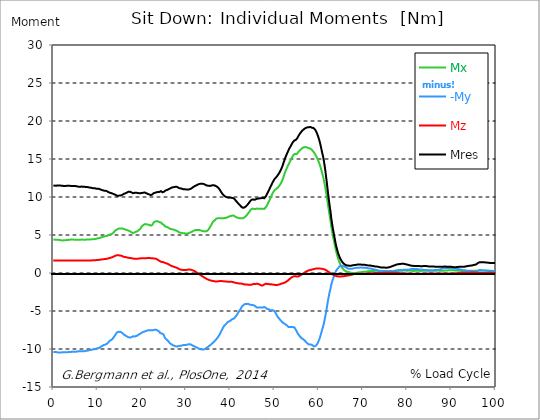
| Category |  Mx |  -My |  Mz |  Mres |
|---|---|---|---|---|
| 0.0 | 4.4 | -10.39 | 1.64 | 11.49 |
| 0.167348456675344 | 4.4 | -10.41 | 1.64 | 11.5 |
| 0.334696913350688 | 4.39 | -10.41 | 1.64 | 11.5 |
| 0.5020453700260321 | 4.38 | -10.42 | 1.64 | 11.5 |
| 0.669393826701376 | 4.38 | -10.41 | 1.64 | 11.49 |
| 0.83674228337672 | 4.38 | -10.42 | 1.64 | 11.5 |
| 1.0040907400520642 | 4.37 | -10.45 | 1.64 | 11.52 |
| 1.1621420602454444 | 4.35 | -10.45 | 1.64 | 11.52 |
| 1.3294905169207885 | 4.35 | -10.45 | 1.64 | 11.51 |
| 1.4968389735961325 | 4.34 | -10.45 | 1.64 | 11.51 |
| 1.6641874302714765 | 4.32 | -10.45 | 1.64 | 11.5 |
| 1.8315358869468206 | 4.29 | -10.45 | 1.64 | 11.49 |
| 1.9988843436221646 | 4.28 | -10.44 | 1.65 | 11.47 |
| 2.1662328002975086 | 4.28 | -10.43 | 1.65 | 11.46 |
| 2.333581256972853 | 4.3 | -10.43 | 1.65 | 11.46 |
| 2.5009297136481967 | 4.31 | -10.42 | 1.64 | 11.46 |
| 2.6682781703235405 | 4.31 | -10.41 | 1.64 | 11.45 |
| 2.8356266269988843 | 4.32 | -10.41 | 1.63 | 11.46 |
| 3.002975083674229 | 4.33 | -10.43 | 1.63 | 11.47 |
| 3.1703235403495724 | 4.35 | -10.42 | 1.63 | 11.47 |
| 3.337671997024917 | 4.35 | -10.41 | 1.64 | 11.47 |
| 3.4957233172182973 | 4.37 | -10.41 | 1.64 | 11.47 |
| 3.663071773893641 | 4.38 | -10.41 | 1.64 | 11.47 |
| 3.8304202305689854 | 4.39 | -10.4 | 1.64 | 11.46 |
| 3.997768687244329 | 4.4 | -10.38 | 1.65 | 11.46 |
| 4.165117143919673 | 4.41 | -10.37 | 1.65 | 11.45 |
| 4.332465600595017 | 4.4 | -10.36 | 1.65 | 11.44 |
| 4.499814057270361 | 4.4 | -10.36 | 1.65 | 11.43 |
| 4.667162513945706 | 4.39 | -10.37 | 1.65 | 11.44 |
| 4.834510970621049 | 4.39 | -10.37 | 1.65 | 11.44 |
| 5.001859427296393 | 4.38 | -10.37 | 1.65 | 11.44 |
| 5.169207883971737 | 4.37 | -10.37 | 1.65 | 11.43 |
| 5.336556340647081 | 4.37 | -10.34 | 1.65 | 11.4 |
| 5.503904797322425 | 4.36 | -10.31 | 1.66 | 11.38 |
| 5.671253253997769 | 4.36 | -10.3 | 1.66 | 11.36 |
| 5.82930457419115 | 4.36 | -10.29 | 1.65 | 11.35 |
| 5.996653030866494 | 4.36 | -10.28 | 1.65 | 11.34 |
| 6.164001487541838 | 4.39 | -10.28 | 1.65 | 11.35 |
| 6.331349944217181 | 4.4 | -10.29 | 1.65 | 11.37 |
| 6.498698400892526 | 4.4 | -10.3 | 1.66 | 11.38 |
| 6.66604685756787 | 4.39 | -10.29 | 1.66 | 11.36 |
| 6.833395314243213 | 4.39 | -10.28 | 1.66 | 11.35 |
| 7.000743770918558 | 4.39 | -10.29 | 1.66 | 11.36 |
| 7.168092227593902 | 4.38 | -10.27 | 1.66 | 11.34 |
| 7.335440684269246 | 4.39 | -10.23 | 1.66 | 11.31 |
| 7.50278914094459 | 4.4 | -10.22 | 1.66 | 11.3 |
| 7.6701375976199335 | 4.41 | -10.23 | 1.66 | 11.31 |
| 7.837486054295278 | 4.41 | -10.22 | 1.66 | 11.3 |
| 7.995537374488658 | 4.41 | -10.18 | 1.66 | 11.27 |
| 8.162885831164003 | 4.42 | -10.14 | 1.66 | 11.24 |
| 8.330234287839346 | 4.42 | -10.13 | 1.66 | 11.23 |
| 8.49758274451469 | 4.43 | -10.14 | 1.65 | 11.24 |
| 8.664931201190035 | 4.43 | -10.11 | 1.66 | 11.21 |
| 8.832279657865378 | 4.43 | -10.06 | 1.67 | 11.17 |
| 8.999628114540721 | 4.44 | -10.03 | 1.68 | 11.14 |
| 9.166976571216066 | 4.46 | -10.04 | 1.67 | 11.16 |
| 9.334325027891412 | 4.47 | -10.04 | 1.67 | 11.16 |
| 9.501673484566755 | 4.48 | -10 | 1.68 | 11.13 |
| 9.669021941242098 | 4.5 | -9.95 | 1.7 | 11.1 |
| 9.836370397917442 | 4.53 | -9.92 | 1.71 | 11.08 |
| 10.003718854592787 | 4.56 | -9.9 | 1.71 | 11.08 |
| 10.17106731126813 | 4.58 | -9.89 | 1.72 | 11.08 |
| 10.329118631461512 | 4.59 | -9.87 | 1.73 | 11.07 |
| 10.496467088136853 | 4.62 | -9.8 | 1.75 | 11.02 |
| 10.663815544812199 | 4.65 | -9.73 | 1.76 | 10.98 |
| 10.831164001487544 | 4.69 | -9.68 | 1.77 | 10.96 |
| 10.998512458162887 | 4.72 | -9.62 | 1.79 | 10.92 |
| 11.16586091483823 | 4.75 | -9.56 | 1.8 | 10.89 |
| 11.333209371513574 | 4.78 | -9.49 | 1.82 | 10.85 |
| 11.50055782818892 | 4.8 | -9.48 | 1.82 | 10.84 |
| 11.667906284864264 | 4.83 | -9.43 | 1.83 | 10.82 |
| 11.835254741539607 | 4.86 | -9.41 | 1.83 | 10.82 |
| 12.00260319821495 | 4.87 | -9.36 | 1.86 | 10.8 |
| 12.169951654890292 | 4.89 | -9.29 | 1.88 | 10.74 |
| 12.337300111565641 | 4.93 | -9.19 | 1.91 | 10.68 |
| 12.504648568240984 | 4.98 | -9.07 | 1.94 | 10.63 |
| 12.662699888434362 | 5.02 | -8.96 | 1.97 | 10.58 |
| 12.830048345109708 | 5.05 | -8.89 | 1.99 | 10.54 |
| 12.997396801785053 | 5.1 | -8.84 | 2.02 | 10.53 |
| 13.164745258460396 | 5.14 | -8.78 | 2.04 | 10.5 |
| 13.33209371513574 | 5.17 | -8.7 | 2.08 | 10.46 |
| 13.499442171811083 | 5.24 | -8.58 | 2.13 | 10.42 |
| 13.666790628486426 | 5.37 | -8.43 | 2.18 | 10.37 |
| 13.834139085161771 | 5.5 | -8.29 | 2.22 | 10.34 |
| 14.001487541837117 | 5.59 | -8.15 | 2.26 | 10.3 |
| 14.16883599851246 | 5.66 | -7.99 | 2.3 | 10.23 |
| 14.336184455187803 | 5.71 | -7.85 | 2.34 | 10.18 |
| 14.503532911863147 | 5.78 | -7.75 | 2.34 | 10.16 |
| 14.670881368538492 | 5.82 | -7.74 | 2.35 | 10.17 |
| 14.828932688731873 | 5.85 | -7.73 | 2.35 | 10.18 |
| 14.996281145407215 | 5.87 | -7.75 | 2.3 | 10.19 |
| 15.163629602082558 | 5.88 | -7.72 | 2.31 | 10.19 |
| 15.330978058757903 | 5.86 | -7.79 | 2.28 | 10.22 |
| 15.498326515433247 | 5.86 | -7.85 | 2.24 | 10.25 |
| 15.665674972108594 | 5.85 | -7.95 | 2.19 | 10.31 |
| 15.833023428783937 | 5.8 | -8.06 | 2.13 | 10.39 |
| 16.00037188545928 | 5.77 | -8.12 | 2.12 | 10.43 |
| 16.167720342134626 | 5.76 | -8.17 | 2.12 | 10.47 |
| 16.335068798809967 | 5.71 | -8.24 | 2.09 | 10.5 |
| 16.502417255485312 | 5.68 | -8.27 | 2.07 | 10.54 |
| 16.669765712160658 | 5.64 | -8.36 | 2.04 | 10.6 |
| 16.837114168836 | 5.6 | -8.43 | 2.02 | 10.65 |
| 17.004462625511344 | 5.58 | -8.46 | 2 | 10.69 |
| 17.16251394570472 | 5.54 | -8.51 | 1.98 | 10.73 |
| 17.32986240238007 | 5.48 | -8.49 | 1.97 | 10.69 |
| 17.497210859055414 | 5.42 | -8.47 | 1.96 | 10.65 |
| 17.664559315730756 | 5.36 | -8.44 | 1.95 | 10.61 |
| 17.8319077724061 | 5.25 | -8.36 | 1.91 | 10.49 |
| 17.999256229081443 | 5.24 | -8.33 | 1.9 | 10.49 |
| 18.166604685756788 | 5.28 | -8.35 | 1.9 | 10.52 |
| 18.333953142432133 | 5.34 | -8.36 | 1.88 | 10.55 |
| 18.501301599107478 | 5.38 | -8.32 | 1.88 | 10.56 |
| 18.668650055782823 | 5.42 | -8.3 | 1.87 | 10.55 |
| 18.835998512458165 | 5.45 | -8.28 | 1.85 | 10.55 |
| 19.00334696913351 | 5.5 | -8.23 | 1.87 | 10.54 |
| 19.170695425808855 | 5.58 | -8.16 | 1.89 | 10.52 |
| 19.338043882484197 | 5.66 | -8.08 | 1.91 | 10.5 |
| 19.496095202677576 | 5.75 | -7.99 | 1.93 | 10.48 |
| 19.66344365935292 | 5.83 | -7.97 | 1.92 | 10.5 |
| 19.830792116028263 | 5.98 | -7.91 | 1.94 | 10.52 |
| 19.998140572703612 | 6.14 | -7.85 | 1.95 | 10.53 |
| 20.165489029378953 | 6.22 | -7.8 | 1.95 | 10.55 |
| 20.3328374860543 | 6.3 | -7.75 | 1.94 | 10.57 |
| 20.500185942729644 | 6.39 | -7.71 | 1.95 | 10.59 |
| 20.667534399404985 | 6.43 | -7.69 | 1.95 | 10.59 |
| 20.83488285608033 | 6.44 | -7.66 | 1.96 | 10.55 |
| 21.002231312755672 | 6.42 | -7.62 | 1.95 | 10.5 |
| 21.16957976943102 | 6.4 | -7.57 | 1.96 | 10.45 |
| 21.336928226106362 | 6.37 | -7.55 | 1.97 | 10.41 |
| 21.504276682781704 | 6.36 | -7.54 | 1.97 | 10.39 |
| 21.67162513945705 | 6.34 | -7.53 | 1.97 | 10.34 |
| 21.82967645965043 | 6.28 | -7.53 | 1.96 | 10.29 |
| 21.997024916325774 | 6.23 | -7.52 | 1.95 | 10.25 |
| 22.16437337300112 | 6.22 | -7.52 | 1.95 | 10.24 |
| 22.33172182967646 | 6.31 | -7.55 | 1.93 | 10.31 |
| 22.499070286351806 | 6.46 | -7.54 | 1.92 | 10.4 |
| 22.666418743027148 | 6.64 | -7.5 | 1.92 | 10.5 |
| 22.833767199702496 | 6.71 | -7.46 | 1.93 | 10.53 |
| 23.00111565637784 | 6.76 | -7.45 | 1.9 | 10.56 |
| 23.168464113053183 | 6.8 | -7.47 | 1.87 | 10.59 |
| 23.335812569728528 | 6.83 | -7.49 | 1.84 | 10.62 |
| 23.50316102640387 | 6.83 | -7.53 | 1.79 | 10.65 |
| 23.670509483079215 | 6.79 | -7.61 | 1.71 | 10.66 |
| 23.83785793975456 | 6.74 | -7.62 | 1.66 | 10.63 |
| 23.995909259947936 | 6.68 | -7.74 | 1.6 | 10.67 |
| 24.163257716623285 | 6.68 | -7.91 | 1.53 | 10.75 |
| 24.330606173298627 | 6.64 | -8 | 1.47 | 10.77 |
| 24.49795462997397 | 6.55 | -7.96 | 1.45 | 10.69 |
| 24.665303086649313 | 6.44 | -7.97 | 1.44 | 10.62 |
| 24.83265154332466 | 6.36 | -8.05 | 1.43 | 10.62 |
| 25.0 | 6.31 | -8.21 | 1.41 | 10.69 |
| 25.167348456675345 | 6.2 | -8.47 | 1.34 | 10.79 |
| 25.334696913350694 | 6.11 | -8.62 | 1.3 | 10.85 |
| 25.502045370026035 | 6.09 | -8.73 | 1.27 | 10.9 |
| 25.669393826701377 | 6.06 | -8.78 | 1.25 | 10.92 |
| 25.836742283376722 | 6.02 | -8.87 | 1.21 | 10.96 |
| 26.004090740052067 | 5.97 | -8.98 | 1.17 | 11.01 |
| 26.17143919672741 | 5.89 | -9.11 | 1.11 | 11.06 |
| 26.329490516920792 | 5.82 | -9.23 | 1.04 | 11.11 |
| 26.49683897359613 | 5.79 | -9.3 | 0.98 | 11.16 |
| 26.66418743027148 | 5.77 | -9.37 | 0.94 | 11.2 |
| 26.831535886946828 | 5.75 | -9.43 | 0.91 | 11.24 |
| 26.998884343622166 | 5.74 | -9.49 | 0.87 | 11.28 |
| 27.166232800297514 | 5.72 | -9.53 | 0.84 | 11.31 |
| 27.333581256972852 | 5.68 | -9.57 | 0.8 | 11.31 |
| 27.5009297136482 | 5.63 | -9.61 | 0.77 | 11.33 |
| 27.668278170323543 | 5.6 | -9.65 | 0.74 | 11.35 |
| 27.835626626998888 | 5.58 | -9.67 | 0.71 | 11.35 |
| 28.002975083674233 | 5.53 | -9.67 | 0.66 | 11.33 |
| 28.170323540349575 | 5.46 | -9.67 | 0.61 | 11.29 |
| 28.33767199702492 | 5.38 | -9.61 | 0.55 | 11.2 |
| 28.50502045370026 | 5.33 | -9.58 | 0.5 | 11.15 |
| 28.663071773893645 | 5.3 | -9.58 | 0.46 | 11.14 |
| 28.830420230568986 | 5.3 | -9.58 | 0.44 | 11.14 |
| 28.99776868724433 | 5.28 | -9.56 | 0.43 | 11.11 |
| 29.165117143919673 | 5.25 | -9.52 | 0.4 | 11.06 |
| 29.33246560059502 | 5.23 | -9.49 | 0.39 | 11.03 |
| 29.499814057270367 | 5.22 | -9.48 | 0.38 | 11.02 |
| 29.66716251394571 | 5.22 | -9.47 | 0.38 | 11.01 |
| 29.834510970621054 | 5.2 | -9.47 | 0.39 | 11.01 |
| 30.00185942729639 | 5.18 | -9.46 | 0.4 | 11 |
| 30.169207883971744 | 5.18 | -9.45 | 0.41 | 11 |
| 30.33655634064708 | 5.19 | -9.42 | 0.43 | 11 |
| 30.50390479732243 | 5.23 | -9.39 | 0.45 | 10.99 |
| 30.671253253997772 | 5.26 | -9.37 | 0.46 | 11 |
| 30.829304574191156 | 5.3 | -9.38 | 0.45 | 11.03 |
| 30.996653030866494 | 5.34 | -9.39 | 0.44 | 11.06 |
| 31.164001487541842 | 5.39 | -9.44 | 0.42 | 11.12 |
| 31.331349944217187 | 5.43 | -9.49 | 0.39 | 11.18 |
| 31.498698400892525 | 5.49 | -9.54 | 0.36 | 11.26 |
| 31.666046857567874 | 5.55 | -9.6 | 0.32 | 11.33 |
| 31.833395314243212 | 5.61 | -9.65 | 0.28 | 11.4 |
| 32.00074377091856 | 5.63 | -9.69 | 0.22 | 11.44 |
| 32.1680922275939 | 5.66 | -9.73 | 0.16 | 11.49 |
| 32.33544068426925 | 5.67 | -9.78 | 0.1 | 11.53 |
| 32.50278914094459 | 5.65 | -9.83 | 0.03 | 11.58 |
| 32.670137597619934 | 5.66 | -9.88 | -0.03 | 11.63 |
| 32.83748605429528 | 5.66 | -9.93 | -0.1 | 11.68 |
| 33.004834510970625 | 5.66 | -9.98 | -0.16 | 11.72 |
| 33.162885831164004 | 5.63 | -10.01 | -0.23 | 11.73 |
| 33.33023428783935 | 5.6 | -10.03 | -0.29 | 11.74 |
| 33.497582744514695 | 5.57 | -10.06 | -0.36 | 11.75 |
| 33.664931201190036 | 5.54 | -10.07 | -0.42 | 11.74 |
| 33.83227965786538 | 5.52 | -10.07 | -0.49 | 11.73 |
| 33.99962811454073 | 5.49 | -10.07 | -0.55 | 11.72 |
| 34.16697657121607 | 5.47 | -10.05 | -0.61 | 11.69 |
| 34.33432502789141 | 5.47 | -9.98 | -0.67 | 11.62 |
| 34.50167348456676 | 5.47 | -9.92 | -0.72 | 11.56 |
| 34.6690219412421 | 5.51 | -9.85 | -0.78 | 11.52 |
| 34.83637039791744 | 5.57 | -9.78 | -0.83 | 11.5 |
| 35.00371885459279 | 5.66 | -9.71 | -0.87 | 11.48 |
| 35.17106731126814 | 5.8 | -9.63 | -0.91 | 11.46 |
| 35.338415767943474 | 5.96 | -9.55 | -0.94 | 11.46 |
| 35.49646708813686 | 6.13 | -9.49 | -0.97 | 11.49 |
| 35.6638155448122 | 6.29 | -9.39 | -1 | 11.49 |
| 35.831164001487544 | 6.48 | -9.3 | -1.02 | 11.52 |
| 35.998512458162885 | 6.66 | -9.21 | -1.04 | 11.55 |
| 36.165860914838234 | 6.8 | -9.12 | -1.06 | 11.57 |
| 36.333209371513576 | 6.88 | -9.04 | -1.08 | 11.54 |
| 36.50055782818892 | 6.93 | -8.94 | -1.09 | 11.49 |
| 36.667906284864266 | 7.05 | -8.83 | -1.11 | 11.47 |
| 36.83525474153961 | 7.14 | -8.72 | -1.11 | 11.43 |
| 37.002603198214956 | 7.18 | -8.6 | -1.11 | 11.36 |
| 37.1699516548903 | 7.22 | -8.48 | -1.11 | 11.29 |
| 37.337300111565646 | 7.22 | -8.34 | -1.09 | 11.18 |
| 37.50464856824098 | 7.22 | -8.19 | -1.07 | 11.06 |
| 37.66269988843437 | 7.23 | -8.01 | -1.06 | 10.93 |
| 37.83004834510971 | 7.21 | -7.8 | -1.06 | 10.76 |
| 37.99739680178505 | 7.2 | -7.6 | -1.06 | 10.6 |
| 38.16474525846039 | 7.22 | -7.42 | -1.06 | 10.47 |
| 38.33209371513574 | 7.22 | -7.23 | -1.08 | 10.34 |
| 38.49944217181109 | 7.21 | -7.05 | -1.09 | 10.21 |
| 38.666790628486424 | 7.23 | -6.95 | -1.1 | 10.15 |
| 38.83413908516178 | 7.25 | -6.83 | -1.11 | 10.08 |
| 39.001487541837115 | 7.26 | -6.72 | -1.12 | 10.02 |
| 39.16883599851246 | 7.27 | -6.64 | -1.13 | 9.98 |
| 39.336184455187805 | 7.32 | -6.52 | -1.14 | 9.95 |
| 39.503532911863154 | 7.37 | -6.41 | -1.15 | 9.92 |
| 39.670881368538495 | 7.4 | -6.33 | -1.15 | 9.9 |
| 39.83822982521384 | 7.46 | -6.36 | -1.15 | 9.97 |
| 39.996281145407224 | 7.47 | -6.29 | -1.15 | 9.93 |
| 40.163629602082565 | 7.5 | -6.2 | -1.14 | 9.9 |
| 40.33097805875791 | 7.54 | -6.13 | -1.15 | 9.89 |
| 40.498326515433256 | 7.57 | -6.06 | -1.17 | 9.88 |
| 40.6656749721086 | 7.58 | -6.01 | -1.21 | 9.85 |
| 40.83302342878393 | 7.54 | -5.99 | -1.24 | 9.81 |
| 41.00037188545929 | 7.45 | -5.94 | -1.26 | 9.71 |
| 41.16772034213463 | 7.39 | -5.77 | -1.3 | 9.57 |
| 41.33506879880997 | 7.35 | -5.65 | -1.31 | 9.47 |
| 41.50241725548531 | 7.31 | -5.51 | -1.32 | 9.36 |
| 41.66976571216066 | 7.27 | -5.34 | -1.34 | 9.23 |
| 41.837114168836 | 7.24 | -5.17 | -1.38 | 9.12 |
| 42.004462625511344 | 7.22 | -5.03 | -1.39 | 9.03 |
| 42.17181108218669 | 7.2 | -4.9 | -1.39 | 8.94 |
| 42.32986240238007 | 7.19 | -4.75 | -1.38 | 8.83 |
| 42.497210859055414 | 7.19 | -4.55 | -1.39 | 8.71 |
| 42.66455931573076 | 7.19 | -4.4 | -1.41 | 8.64 |
| 42.831907772406105 | 7.2 | -4.28 | -1.44 | 8.59 |
| 42.999256229081446 | 7.23 | -4.2 | -1.47 | 8.58 |
| 43.16660468575679 | 7.3 | -4.13 | -1.5 | 8.61 |
| 43.33395314243214 | 7.37 | -4.08 | -1.52 | 8.66 |
| 43.50130159910748 | 7.46 | -4.09 | -1.51 | 8.74 |
| 43.66865005578282 | 7.56 | -4.08 | -1.51 | 8.83 |
| 43.83599851245817 | 7.69 | -4.07 | -1.53 | 8.94 |
| 44.00334696913351 | 7.81 | -4.05 | -1.54 | 9.04 |
| 44.17069542580886 | 7.94 | -4.11 | -1.54 | 9.18 |
| 44.3380438824842 | 8.07 | -4.15 | -1.54 | 9.32 |
| 44.49609520267758 | 8.21 | -4.15 | -1.55 | 9.44 |
| 44.66344365935292 | 8.35 | -4.19 | -1.56 | 9.57 |
| 44.83079211602827 | 8.43 | -4.21 | -1.55 | 9.65 |
| 44.99814057270361 | 8.47 | -4.21 | -1.5 | 9.68 |
| 45.16548902937895 | 8.48 | -4.17 | -1.45 | 9.66 |
| 45.332837486054295 | 8.45 | -4.25 | -1.43 | 9.65 |
| 45.500185942729644 | 8.43 | -4.32 | -1.43 | 9.65 |
| 45.66753439940499 | 8.41 | -4.38 | -1.44 | 9.66 |
| 45.83488285608033 | 8.45 | -4.44 | -1.44 | 9.71 |
| 46.00223131275568 | 8.48 | -4.53 | -1.42 | 9.78 |
| 46.16957976943102 | 8.49 | -4.55 | -1.43 | 9.81 |
| 46.336928226106366 | 8.46 | -4.54 | -1.44 | 9.79 |
| 46.50427668278171 | 8.44 | -4.55 | -1.48 | 9.8 |
| 46.671625139457056 | 8.46 | -4.53 | -1.53 | 9.83 |
| 46.829676459650436 | 8.46 | -4.52 | -1.58 | 9.84 |
| 46.99702491632577 | 8.44 | -4.53 | -1.63 | 9.85 |
| 47.16437337300112 | 8.44 | -4.54 | -1.66 | 9.87 |
| 47.33172182967646 | 8.46 | -4.55 | -1.63 | 9.9 |
| 47.49907028635181 | 8.43 | -4.52 | -1.58 | 9.86 |
| 47.66641874302716 | 8.42 | -4.47 | -1.51 | 9.83 |
| 47.83376719970249 | 8.5 | -4.53 | -1.46 | 9.93 |
| 48.001115656377834 | 8.62 | -4.58 | -1.42 | 10.05 |
| 48.16846411305319 | 8.76 | -4.66 | -1.42 | 10.23 |
| 48.33581256972853 | 8.95 | -4.72 | -1.44 | 10.43 |
| 48.50316102640387 | 9.14 | -4.78 | -1.44 | 10.63 |
| 48.67050948307921 | 9.33 | -4.77 | -1.45 | 10.8 |
| 48.837857939754564 | 9.53 | -4.82 | -1.5 | 11.02 |
| 49.005206396429905 | 9.74 | -4.88 | -1.5 | 11.24 |
| 49.163257716623285 | 9.96 | -4.91 | -1.49 | 11.44 |
| 49.33060617329863 | 10.17 | -4.9 | -1.49 | 11.62 |
| 49.49795462997397 | 10.39 | -4.91 | -1.51 | 11.84 |
| 49.66530308664932 | 10.58 | -4.91 | -1.53 | 12.02 |
| 49.832651543324666 | 10.74 | -4.93 | -1.54 | 12.18 |
| 50.0 | 10.89 | -5.02 | -1.55 | 12.36 |
| 50.16734845667534 | 10.97 | -5.17 | -1.56 | 12.48 |
| 50.33469691335069 | 11.03 | -5.34 | -1.58 | 12.56 |
| 50.50204537002604 | 11.1 | -5.54 | -1.58 | 12.68 |
| 50.66939382670139 | 11.19 | -5.71 | -1.57 | 12.81 |
| 50.836742283376715 | 11.29 | -5.85 | -1.54 | 12.96 |
| 51.00409074005207 | 11.4 | -5.97 | -1.52 | 13.1 |
| 51.17143919672741 | 11.53 | -6.08 | -1.49 | 13.26 |
| 51.32949051692079 | 11.69 | -6.2 | -1.46 | 13.45 |
| 51.496838973596134 | 11.86 | -6.31 | -1.42 | 13.65 |
| 51.66418743027148 | 12.06 | -6.42 | -1.38 | 13.87 |
| 51.831535886946824 | 12.29 | -6.51 | -1.35 | 14.13 |
| 51.99888434362217 | 12.58 | -6.61 | -1.33 | 14.43 |
| 52.16623280029752 | 12.86 | -6.64 | -1.3 | 14.71 |
| 52.33358125697285 | 13.15 | -6.7 | -1.26 | 15 |
| 52.5009297136482 | 13.41 | -6.76 | -1.21 | 15.25 |
| 52.668278170323546 | 13.64 | -6.81 | -1.14 | 15.49 |
| 52.835626626998895 | 13.86 | -6.91 | -1.07 | 15.72 |
| 53.00297508367424 | 14.07 | -7 | -1 | 15.94 |
| 53.17032354034958 | 14.27 | -7.1 | -0.92 | 16.16 |
| 53.33767199702492 | 14.47 | -7.15 | -0.84 | 16.37 |
| 53.50502045370027 | 14.66 | -7.12 | -0.74 | 16.53 |
| 53.663071773893655 | 14.85 | -7.12 | -0.66 | 16.71 |
| 53.83042023056899 | 15.06 | -7.12 | -0.59 | 16.89 |
| 53.99776868724433 | 15.25 | -7.12 | -0.53 | 17.06 |
| 54.16511714391967 | 15.41 | -7.12 | -0.49 | 17.22 |
| 54.33246560059503 | 15.56 | -7.12 | -0.45 | 17.34 |
| 54.49981405727037 | 15.66 | -7.15 | -0.42 | 17.44 |
| 54.667162513945705 | 15.68 | -7.26 | -0.41 | 17.48 |
| 54.834510970621054 | 15.64 | -7.48 | -0.44 | 17.52 |
| 55.0018594272964 | 15.63 | -7.66 | -0.47 | 17.58 |
| 55.169207883971744 | 15.73 | -7.85 | -0.47 | 17.75 |
| 55.336556340647086 | 15.87 | -8.02 | -0.46 | 17.94 |
| 55.50390479732243 | 15.99 | -8.16 | -0.42 | 18.12 |
| 55.671253253997776 | 16.09 | -8.29 | -0.36 | 18.27 |
| 55.83860171067312 | 16.2 | -8.41 | -0.31 | 18.41 |
| 55.9966530308665 | 16.29 | -8.47 | -0.25 | 18.54 |
| 56.16400148754184 | 16.38 | -8.6 | -0.19 | 18.67 |
| 56.33134994421718 | 16.46 | -8.65 | -0.13 | 18.77 |
| 56.498698400892536 | 16.5 | -8.71 | -0.06 | 18.85 |
| 56.66604685756788 | 16.54 | -8.78 | 0.01 | 18.93 |
| 56.83339531424321 | 16.56 | -8.89 | 0.07 | 19 |
| 57.00074377091856 | 16.57 | -9.02 | 0.13 | 19.07 |
| 57.16809222759391 | 16.55 | -9.11 | 0.19 | 19.11 |
| 57.33544068426925 | 16.53 | -9.19 | 0.24 | 19.14 |
| 57.5027891409446 | 16.49 | -9.29 | 0.29 | 19.17 |
| 57.670137597619934 | 16.44 | -9.39 | 0.33 | 19.19 |
| 57.83748605429528 | 16.4 | -9.42 | 0.37 | 19.19 |
| 58.004834510970625 | 16.39 | -9.37 | 0.39 | 19.2 |
| 58.16288583116401 | 16.36 | -9.41 | 0.41 | 19.21 |
| 58.330234287839346 | 16.28 | -9.46 | 0.43 | 19.19 |
| 58.497582744514695 | 16.16 | -9.46 | 0.46 | 19.11 |
| 58.66493120119004 | 16.04 | -9.58 | 0.48 | 19.1 |
| 58.832279657865385 | 15.92 | -9.65 | 0.5 | 19.07 |
| 58.999628114540734 | 15.81 | -9.68 | 0.53 | 19.01 |
| 59.16697657121607 | 15.65 | -9.64 | 0.55 | 18.88 |
| 59.33432502789142 | 15.47 | -9.57 | 0.58 | 18.71 |
| 59.50167348456676 | 15.28 | -9.48 | 0.6 | 18.51 |
| 59.66902194124211 | 15.08 | -9.33 | 0.6 | 18.29 |
| 59.83637039791745 | 14.86 | -9.14 | 0.6 | 18.02 |
| 60.00371885459278 | 14.62 | -8.92 | 0.59 | 17.72 |
| 60.17106731126813 | 14.36 | -8.67 | 0.58 | 17.39 |
| 60.33841576794349 | 14.06 | -8.37 | 0.58 | 17.02 |
| 60.49646708813685 | 13.74 | -8.04 | 0.57 | 16.59 |
| 60.6638155448122 | 13.38 | -7.68 | 0.56 | 16.13 |
| 60.831164001487544 | 13.01 | -7.33 | 0.55 | 15.68 |
| 60.99851245816289 | 12.66 | -7.03 | 0.53 | 15.29 |
| 61.16586091483824 | 12.22 | -6.61 | 0.5 | 14.75 |
| 61.333209371513576 | 11.72 | -6.15 | 0.46 | 14.13 |
| 61.50055782818892 | 11.19 | -5.66 | 0.42 | 13.45 |
| 61.667906284864266 | 10.61 | -5.11 | 0.37 | 12.67 |
| 61.835254741539615 | 10 | -4.56 | 0.31 | 11.88 |
| 62.002603198214956 | 9.34 | -3.95 | 0.24 | 11.03 |
| 62.16995165489029 | 8.7 | -3.4 | 0.17 | 10.22 |
| 62.33730011156564 | 8.06 | -2.89 | 0.1 | 9.45 |
| 62.504648568240995 | 7.44 | -2.42 | 0.03 | 8.71 |
| 62.67199702491633 | 6.85 | -2.04 | -0.03 | 8.05 |
| 62.83004834510971 | 6.15 | -1.55 | -0.09 | 7.22 |
| 62.99739680178505 | 5.56 | -1.18 | -0.14 | 6.55 |
| 63.1647452584604 | 5.03 | -0.87 | -0.19 | 5.96 |
| 63.33209371513575 | 4.54 | -0.62 | -0.24 | 5.43 |
| 63.4994421718111 | 4.05 | -0.33 | -0.29 | 4.89 |
| 63.666790628486424 | 3.58 | -0.1 | -0.33 | 4.38 |
| 63.83413908516177 | 3.09 | 0.16 | -0.37 | 3.85 |
| 64.00148754183712 | 2.7 | 0.36 | -0.41 | 3.43 |
| 64.16883599851248 | 2.35 | 0.5 | -0.43 | 3.06 |
| 64.3361844551878 | 2.01 | 0.61 | -0.44 | 2.71 |
| 64.50353291186315 | 1.72 | 0.71 | -0.45 | 2.43 |
| 64.6708813685385 | 1.42 | 0.85 | -0.45 | 2.17 |
| 64.83822982521384 | 1.19 | 0.88 | -0.46 | 1.95 |
| 65.00557828188919 | 0.98 | 0.93 | -0.45 | 1.76 |
| 65.16362960208257 | 0.81 | 0.94 | -0.45 | 1.59 |
| 65.3309780587579 | 0.66 | 0.94 | -0.44 | 1.44 |
| 65.49832651543326 | 0.54 | 0.9 | -0.43 | 1.32 |
| 65.6656749721086 | 0.43 | 0.86 | -0.42 | 1.22 |
| 65.83302342878395 | 0.34 | 0.83 | -0.4 | 1.14 |
| 66.00037188545929 | 0.27 | 0.79 | -0.38 | 1.08 |
| 66.16772034213463 | 0.23 | 0.74 | -0.37 | 1.04 |
| 66.33506879880998 | 0.19 | 0.68 | -0.35 | 1 |
| 66.50241725548531 | 0.16 | 0.62 | -0.34 | 1 |
| 66.66976571216065 | 0.13 | 0.58 | -0.32 | 0.98 |
| 66.83711416883601 | 0.1 | 0.56 | -0.3 | 0.97 |
| 67.00446262551135 | 0.08 | 0.54 | -0.29 | 0.95 |
| 67.1718110821867 | 0.04 | 0.55 | -0.26 | 0.96 |
| 67.32986240238007 | 0.02 | 0.56 | -0.24 | 0.96 |
| 67.49721085905541 | 0.01 | 0.58 | -0.21 | 0.98 |
| 67.66455931573076 | 0.01 | 0.57 | -0.19 | 1.01 |
| 67.83190777240611 | 0.02 | 0.58 | -0.17 | 1.02 |
| 67.99925622908145 | 0.01 | 0.63 | -0.14 | 1.04 |
| 68.16660468575678 | 0 | 0.64 | -0.12 | 1.05 |
| 68.33395314243214 | 0 | 0.66 | -0.1 | 1.06 |
| 68.50130159910749 | 0.02 | 0.69 | -0.09 | 1.08 |
| 68.66865005578282 | 0.03 | 0.69 | -0.08 | 1.1 |
| 68.83599851245816 | 0.05 | 0.68 | -0.09 | 1.12 |
| 69.00334696913352 | 0.07 | 0.7 | -0.1 | 1.13 |
| 69.17069542580886 | 0.09 | 0.7 | -0.11 | 1.13 |
| 69.3380438824842 | 0.09 | 0.71 | -0.11 | 1.11 |
| 69.50539233915956 | 0.09 | 0.72 | -0.1 | 1.11 |
| 69.66344365935292 | 0.11 | 0.71 | -0.1 | 1.1 |
| 69.83079211602826 | 0.14 | 0.69 | -0.11 | 1.1 |
| 69.99814057270362 | 0.15 | 0.69 | -0.12 | 1.09 |
| 70.16548902937896 | 0.17 | 0.7 | -0.13 | 1.09 |
| 70.33283748605429 | 0.17 | 0.71 | -0.11 | 1.09 |
| 70.50018594272964 | 0.17 | 0.71 | -0.1 | 1.07 |
| 70.667534399405 | 0.19 | 0.68 | -0.08 | 1.05 |
| 70.83488285608033 | 0.21 | 0.65 | -0.08 | 1.02 |
| 71.00223131275568 | 0.22 | 0.64 | -0.07 | 1.01 |
| 71.16957976943102 | 0.21 | 0.62 | -0.05 | 0.99 |
| 71.33692822610637 | 0.23 | 0.59 | -0.05 | 0.98 |
| 71.50427668278171 | 0.25 | 0.6 | -0.05 | 0.99 |
| 71.67162513945706 | 0.26 | 0.61 | -0.04 | 0.99 |
| 71.8389735961324 | 0.26 | 0.59 | -0.04 | 0.98 |
| 71.99702491632577 | 0.27 | 0.55 | -0.03 | 0.94 |
| 72.16437337300113 | 0.27 | 0.51 | -0.03 | 0.92 |
| 72.33172182967647 | 0.27 | 0.5 | -0.02 | 0.92 |
| 72.49907028635181 | 0.27 | 0.47 | -0.01 | 0.89 |
| 72.66641874302715 | 0.28 | 0.44 | -0.01 | 0.87 |
| 72.8337671997025 | 0.28 | 0.43 | 0 | 0.86 |
| 73.00111565637783 | 0.28 | 0.4 | 0 | 0.85 |
| 73.16846411305319 | 0.28 | 0.37 | 0 | 0.84 |
| 73.33581256972853 | 0.28 | 0.34 | 0 | 0.83 |
| 73.50316102640387 | 0.28 | 0.32 | 0 | 0.81 |
| 73.67050948307921 | 0.27 | 0.31 | 0.01 | 0.79 |
| 73.83785793975457 | 0.26 | 0.29 | 0.01 | 0.75 |
| 74.00520639642991 | 0.26 | 0.27 | 0.01 | 0.73 |
| 74.16325771662328 | 0.26 | 0.25 | 0.01 | 0.72 |
| 74.33060617329863 | 0.26 | 0.25 | 0.01 | 0.72 |
| 74.49795462997398 | 0.27 | 0.24 | 0.01 | 0.73 |
| 74.66530308664932 | 0.26 | 0.24 | 0.02 | 0.72 |
| 74.83265154332466 | 0.25 | 0.24 | 0.02 | 0.71 |
| 75.00000000000001 | 0.24 | 0.24 | 0.02 | 0.71 |
| 75.16734845667534 | 0.23 | 0.23 | 0.02 | 0.7 |
| 75.3346969133507 | 0.23 | 0.23 | 0.03 | 0.69 |
| 75.50204537002605 | 0.23 | 0.2 | 0.03 | 0.69 |
| 75.66939382670138 | 0.22 | 0.24 | 0.04 | 0.73 |
| 75.83674228337672 | 0.23 | 0.25 | 0.04 | 0.75 |
| 76.00409074005208 | 0.23 | 0.24 | 0.04 | 0.76 |
| 76.17143919672742 | 0.23 | 0.25 | 0.04 | 0.8 |
| 76.33878765340276 | 0.24 | 0.28 | 0.03 | 0.84 |
| 76.49683897359614 | 0.24 | 0.25 | 0.03 | 0.88 |
| 76.66418743027148 | 0.22 | 0.24 | 0.04 | 0.91 |
| 76.83153588694682 | 0.22 | 0.25 | 0.05 | 0.94 |
| 76.99888434362218 | 0.23 | 0.25 | 0.04 | 0.98 |
| 77.16623280029752 | 0.24 | 0.28 | 0.03 | 1.03 |
| 77.33358125697285 | 0.23 | 0.32 | 0.04 | 1.05 |
| 77.5009297136482 | 0.25 | 0.34 | 0.02 | 1.09 |
| 77.66827817032356 | 0.26 | 0.36 | 0.01 | 1.13 |
| 77.83562662699889 | 0.26 | 0.37 | 0 | 1.15 |
| 78.00297508367423 | 0.26 | 0.39 | 0 | 1.15 |
| 78.17032354034959 | 0.26 | 0.41 | 0 | 1.15 |
| 78.33767199702493 | 0.29 | 0.39 | -0.02 | 1.18 |
| 78.50502045370027 | 0.31 | 0.4 | -0.04 | 1.21 |
| 78.67236891037561 | 0.3 | 0.41 | -0.04 | 1.21 |
| 78.83042023056899 | 0.29 | 0.41 | -0.05 | 1.21 |
| 78.99776868724433 | 0.31 | 0.41 | -0.06 | 1.23 |
| 79.16511714391969 | 0.32 | 0.43 | -0.07 | 1.22 |
| 79.33246560059503 | 0.32 | 0.42 | -0.07 | 1.2 |
| 79.49981405727036 | 0.32 | 0.43 | -0.07 | 1.17 |
| 79.66716251394571 | 0.32 | 0.43 | -0.07 | 1.15 |
| 79.83451097062107 | 0.3 | 0.41 | -0.07 | 1.12 |
| 80.00185942729641 | 0.3 | 0.41 | -0.07 | 1.11 |
| 80.16920788397174 | 0.31 | 0.42 | -0.08 | 1.08 |
| 80.33655634064709 | 0.32 | 0.43 | -0.08 | 1.06 |
| 80.50390479732243 | 0.32 | 0.48 | -0.1 | 1.01 |
| 80.67125325399778 | 0.32 | 0.48 | -0.11 | 1 |
| 80.83860171067312 | 0.31 | 0.51 | -0.11 | 0.98 |
| 80.99665303086651 | 0.29 | 0.52 | -0.1 | 0.96 |
| 81.16400148754184 | 0.29 | 0.52 | -0.11 | 0.96 |
| 81.3313499442172 | 0.27 | 0.52 | -0.1 | 0.94 |
| 81.49869840089255 | 0.28 | 0.52 | -0.11 | 0.93 |
| 81.66604685756786 | 0.28 | 0.53 | -0.11 | 0.92 |
| 81.83339531424322 | 0.3 | 0.53 | -0.12 | 0.93 |
| 82.00074377091858 | 0.29 | 0.54 | -0.11 | 0.92 |
| 82.16809222759392 | 0.28 | 0.55 | -0.11 | 0.92 |
| 82.33544068426926 | 0.28 | 0.52 | -0.11 | 0.92 |
| 82.50278914094459 | 0.28 | 0.5 | -0.11 | 0.91 |
| 82.67013759761994 | 0.29 | 0.47 | -0.11 | 0.91 |
| 82.83748605429528 | 0.29 | 0.47 | -0.1 | 0.91 |
| 83.00483451097062 | 0.27 | 0.47 | -0.1 | 0.9 |
| 83.17218296764597 | 0.28 | 0.46 | -0.09 | 0.89 |
| 83.33023428783935 | 0.29 | 0.44 | -0.09 | 0.88 |
| 83.4975827445147 | 0.27 | 0.44 | -0.08 | 0.91 |
| 83.66493120119004 | 0.29 | 0.42 | -0.09 | 0.92 |
| 83.83227965786537 | 0.3 | 0.4 | -0.09 | 0.93 |
| 83.99962811454073 | 0.31 | 0.39 | -0.09 | 0.92 |
| 84.16697657121607 | 0.31 | 0.39 | -0.08 | 0.91 |
| 84.33432502789142 | 0.3 | 0.38 | -0.08 | 0.91 |
| 84.50167348456677 | 0.3 | 0.38 | -0.07 | 0.89 |
| 84.6690219412421 | 0.29 | 0.37 | -0.06 | 0.88 |
| 84.83637039791745 | 0.28 | 0.36 | -0.05 | 0.86 |
| 85.0037188545928 | 0.28 | 0.35 | -0.05 | 0.86 |
| 85.17106731126813 | 0.28 | 0.35 | -0.04 | 0.86 |
| 85.33841576794349 | 0.28 | 0.36 | -0.04 | 0.86 |
| 85.50576422461883 | 0.29 | 0.36 | -0.05 | 0.86 |
| 85.66381554481221 | 0.29 | 0.35 | -0.06 | 0.86 |
| 85.83116400148755 | 0.3 | 0.35 | -0.06 | 0.87 |
| 85.99851245816289 | 0.29 | 0.37 | -0.06 | 0.86 |
| 86.16586091483823 | 0.29 | 0.39 | -0.06 | 0.84 |
| 86.33320937151358 | 0.28 | 0.41 | -0.05 | 0.82 |
| 86.50055782818893 | 0.3 | 0.4 | -0.06 | 0.81 |
| 86.66790628486427 | 0.31 | 0.39 | -0.06 | 0.81 |
| 86.83525474153961 | 0.32 | 0.4 | -0.07 | 0.81 |
| 87.00260319821496 | 0.32 | 0.42 | -0.07 | 0.81 |
| 87.16995165489031 | 0.3 | 0.44 | -0.06 | 0.81 |
| 87.33730011156564 | 0.3 | 0.45 | -0.06 | 0.81 |
| 87.504648568241 | 0.31 | 0.48 | -0.06 | 0.82 |
| 87.67199702491634 | 0.31 | 0.52 | -0.06 | 0.82 |
| 87.83004834510972 | 0.31 | 0.57 | -0.06 | 0.81 |
| 87.99739680178506 | 0.31 | 0.61 | -0.07 | 0.83 |
| 88.1647452584604 | 0.31 | 0.63 | -0.06 | 0.84 |
| 88.33209371513574 | 0.31 | 0.64 | -0.06 | 0.84 |
| 88.49944217181108 | 0.32 | 0.67 | -0.07 | 0.85 |
| 88.66679062848644 | 0.32 | 0.67 | -0.07 | 0.85 |
| 88.83413908516178 | 0.32 | 0.66 | -0.07 | 0.83 |
| 89.00148754183712 | 0.34 | 0.64 | -0.07 | 0.81 |
| 89.16883599851246 | 0.35 | 0.64 | -0.08 | 0.81 |
| 89.33618445518782 | 0.35 | 0.65 | -0.08 | 0.81 |
| 89.50353291186315 | 0.35 | 0.66 | -0.07 | 0.81 |
| 89.6708813685385 | 0.35 | 0.66 | -0.07 | 0.81 |
| 89.83822982521386 | 0.36 | 0.66 | -0.07 | 0.81 |
| 90.00557828188919 | 0.36 | 0.65 | -0.07 | 0.81 |
| 90.16362960208257 | 0.37 | 0.63 | -0.07 | 0.8 |
| 90.3309780587579 | 0.36 | 0.61 | -0.06 | 0.78 |
| 90.49832651543326 | 0.35 | 0.6 | -0.06 | 0.76 |
| 90.66567497210859 | 0.34 | 0.6 | -0.05 | 0.76 |
| 90.83302342878395 | 0.34 | 0.59 | -0.05 | 0.75 |
| 91.00037188545929 | 0.34 | 0.57 | -0.04 | 0.76 |
| 91.16772034213463 | 0.33 | 0.54 | -0.02 | 0.77 |
| 91.33506879880998 | 0.32 | 0.52 | -0.01 | 0.79 |
| 91.50241725548533 | 0.31 | 0.52 | -0.01 | 0.81 |
| 91.66976571216065 | 0.29 | 0.51 | 0 | 0.81 |
| 91.83711416883601 | 0.28 | 0.49 | 0.01 | 0.81 |
| 92.00446262551137 | 0.28 | 0.46 | 0.01 | 0.81 |
| 92.1718110821867 | 0.29 | 0.43 | 0.01 | 0.82 |
| 92.33915953886203 | 0.27 | 0.42 | 0.02 | 0.81 |
| 92.49721085905541 | 0.27 | 0.39 | 0.02 | 0.8 |
| 92.66455931573077 | 0.27 | 0.37 | 0.02 | 0.81 |
| 92.83190777240611 | 0.27 | 0.36 | 0.03 | 0.82 |
| 92.99925622908145 | 0.27 | 0.36 | 0.04 | 0.83 |
| 93.1666046857568 | 0.26 | 0.35 | 0.05 | 0.85 |
| 93.33395314243214 | 0.26 | 0.34 | 0.05 | 0.88 |
| 93.50130159910749 | 0.26 | 0.31 | 0.05 | 0.9 |
| 93.66865005578283 | 0.27 | 0.29 | 0.04 | 0.91 |
| 93.83599851245818 | 0.27 | 0.27 | 0.03 | 0.93 |
| 94.00334696913353 | 0.27 | 0.28 | 0.04 | 0.95 |
| 94.17069542580886 | 0.28 | 0.28 | 0.04 | 0.96 |
| 94.3380438824842 | 0.28 | 0.28 | 0.05 | 0.97 |
| 94.50539233915954 | 0.28 | 0.26 | 0.05 | 0.98 |
| 94.66344365935292 | 0.28 | 0.23 | 0.06 | 0.99 |
| 94.83079211602828 | 0.29 | 0.2 | 0.05 | 1.02 |
| 94.99814057270362 | 0.28 | 0.2 | 0.05 | 1.05 |
| 95.16548902937897 | 0.28 | 0.22 | 0.05 | 1.07 |
| 95.33283748605432 | 0.28 | 0.21 | 0.05 | 1.09 |
| 95.50018594272963 | 0.29 | 0.18 | 0.05 | 1.11 |
| 95.66753439940499 | 0.3 | 0.16 | 0.04 | 1.15 |
| 95.83488285608034 | 0.3 | 0.24 | 0.03 | 1.23 |
| 96.00223131275567 | 0.3 | 0.31 | 0.02 | 1.32 |
| 96.16957976943102 | 0.31 | 0.36 | 0.01 | 1.38 |
| 96.33692822610638 | 0.31 | 0.38 | 0 | 1.4 |
| 96.50427668278171 | 0.31 | 0.38 | 0 | 1.42 |
| 96.67162513945706 | 0.31 | 0.38 | 0.01 | 1.41 |
| 96.8389735961324 | 0.31 | 0.36 | 0.01 | 1.4 |
| 96.99702491632577 | 0.32 | 0.33 | 0 | 1.41 |
| 97.16437337300111 | 0.33 | 0.31 | -0.01 | 1.42 |
| 97.33172182967647 | 0.33 | 0.32 | -0.01 | 1.42 |
| 97.49907028635181 | 0.32 | 0.31 | 0 | 1.39 |
| 97.66641874302715 | 0.32 | 0.31 | 0 | 1.39 |
| 97.8337671997025 | 0.32 | 0.3 | 0.01 | 1.38 |
| 98.00111565637785 | 0.32 | 0.28 | 0.01 | 1.37 |
| 98.16846411305319 | 0.33 | 0.27 | 0 | 1.37 |
| 98.33581256972855 | 0.33 | 0.24 | 0.01 | 1.36 |
| 98.50316102640389 | 0.32 | 0.23 | 0.02 | 1.33 |
| 98.67050948307921 | 0.29 | 0.24 | 0.03 | 1.32 |
| 98.83785793975456 | 0.3 | 0.23 | 0.02 | 1.31 |
| 99.0052063964299 | 0.3 | 0.22 | 0.02 | 1.32 |
| 99.17255485310525 | 0.28 | 0.23 | 0.02 | 1.33 |
| 99.33060617329863 | 0.28 | 0.24 | 0.01 | 1.33 |
| 99.49795462997399 | 0.27 | 0.26 | 0.02 | 1.32 |
| 99.66530308664933 | 0.27 | 0.27 | 0.02 | 1.31 |
| 99.83265154332467 | 0.27 | 0.26 | 0.01 | 1.31 |
| 100.0 | 0.29 | 0.25 | 0.01 | 1.31 |